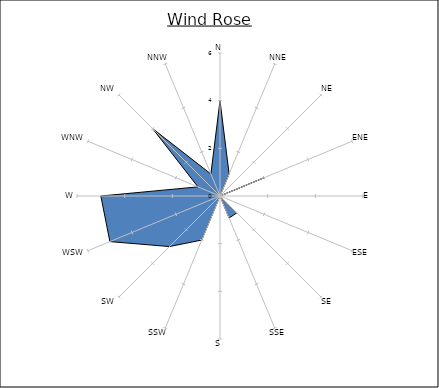
| Category | Series 0 |
|---|---|
| N | 4 |
| NNE | 1 |
| NE | 0 |
| ENE | 2 |
| E | 0 |
| ESE | 0 |
| SE | 1 |
| SSE | 1 |
| S | 0 |
| SSW | 2 |
| SW | 3 |
| WSW | 5 |
| W | 5 |
| WNW | 1 |
| NW | 4 |
| NNW | 1 |